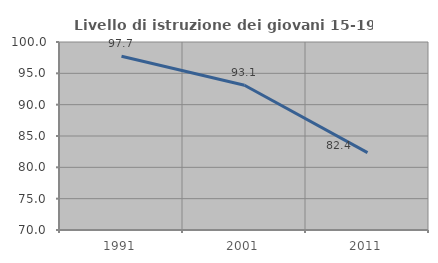
| Category | Livello di istruzione dei giovani 15-19 anni |
|---|---|
| 1991.0 | 97.727 |
| 2001.0 | 93.103 |
| 2011.0 | 82.353 |